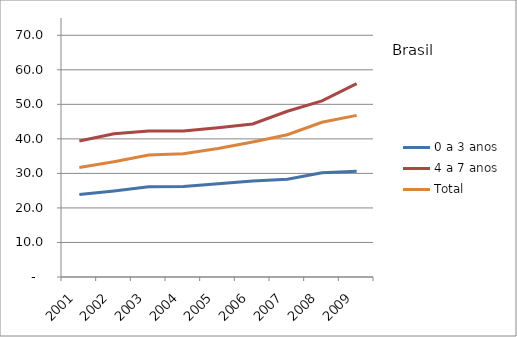
| Category | 0 a 3 anos | 4 a 7 anos | Total |
|---|---|---|---|
| 2001.0 | 23.9 | 39.4 | 31.7 |
| 2002.0 | 24.9 | 41.5 | 33.4 |
| 2003.0 | 26.1 | 42.3 | 35.3 |
| 2004.0 | 26.2 | 42.3 | 35.7 |
| 2005.0 | 27 | 43.2 | 37.2 |
| 2006.0 | 27.8 | 44.3 | 39.1 |
| 2007.0 | 28.3 | 48 | 41.2 |
| 2008.0 | 30.2 | 51 | 44.8 |
| 2009.0 | 30.6 | 56 | 46.8 |